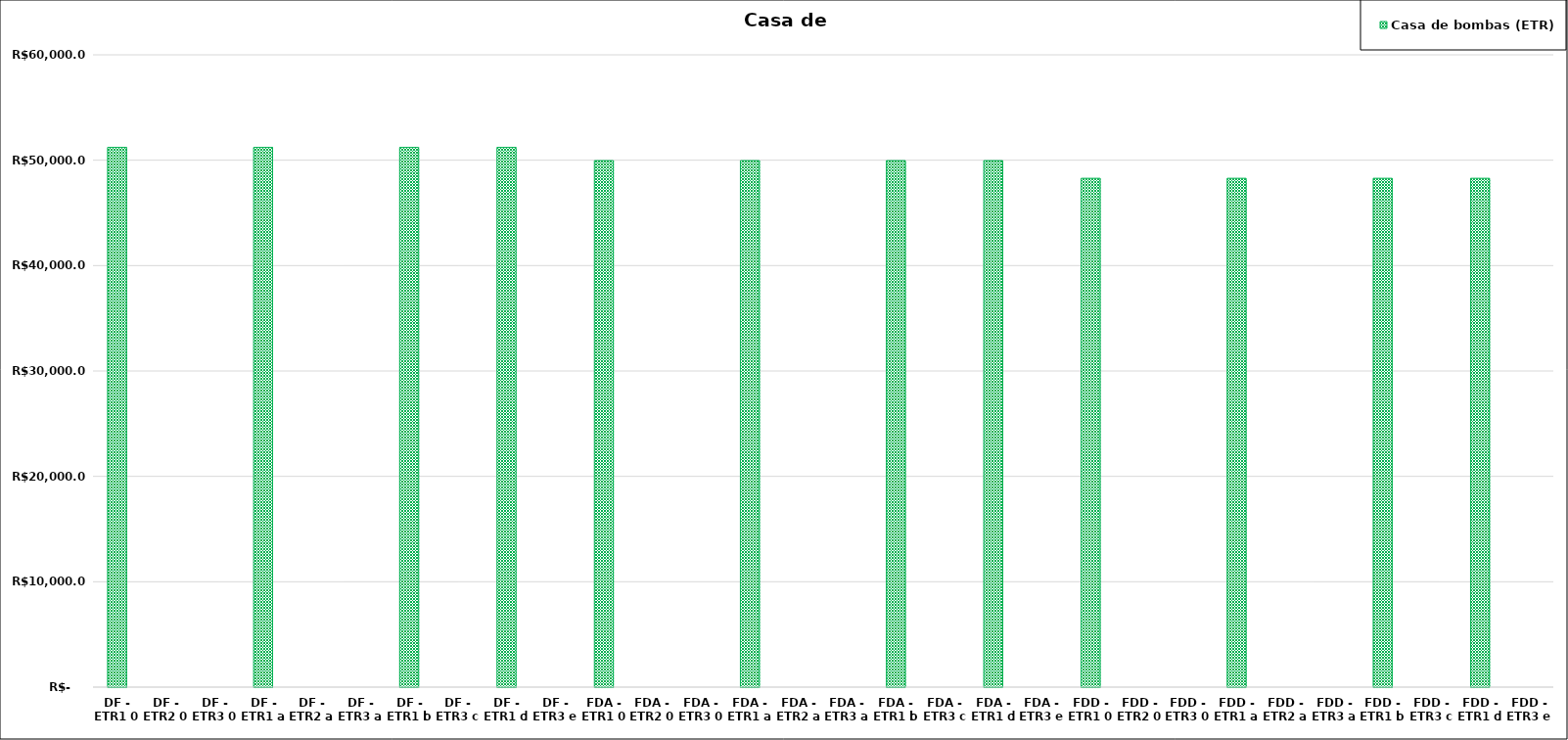
| Category | Casa de bombas (ETR) |
|---|---|
| DF - ETR1 0 | 51215.079 |
| DF - ETR2 0 | 0 |
| DF - ETR3 0 | 0 |
| DF - ETR1 a | 51215.079 |
| DF - ETR2 a | 0 |
| DF - ETR3 a | 0 |
| DF - ETR1 b | 51215.079 |
| DF - ETR3 c | 0 |
| DF - ETR1 d | 51215.079 |
| DF - ETR3 e | 0 |
| FDA - ETR1 0 | 49959.572 |
| FDA - ETR2 0 | 0 |
| FDA - ETR3 0 | 0 |
| FDA - ETR1 a | 49959.572 |
| FDA - ETR2 a | 0 |
| FDA - ETR3 a | 0 |
| FDA - ETR1 b | 49959.572 |
| FDA - ETR3 c | 0 |
| FDA - ETR1 d | 49959.572 |
| FDA - ETR3 e | 0 |
| FDD - ETR1 0 | 48282.744 |
| FDD - ETR2 0 | 0 |
| FDD - ETR3 0 | 0 |
| FDD - ETR1 a | 48282.744 |
| FDD - ETR2 a | 0 |
| FDD - ETR3 a | 0 |
| FDD - ETR1 b | 48282.744 |
| FDD - ETR3 c | 0 |
| FDD - ETR1 d | 48282.744 |
| FDD - ETR3 e | 0 |